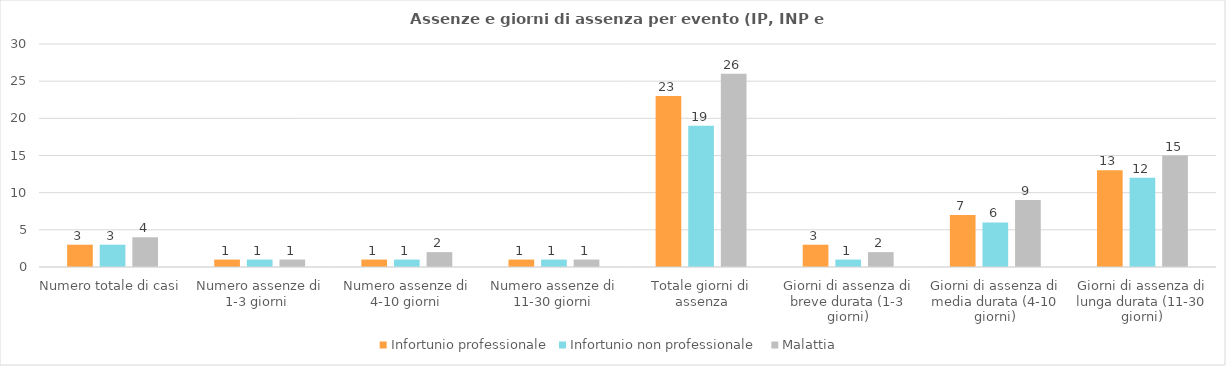
| Category | Infortunio professionale | Infortunio non professionale  | Malattia  |
|---|---|---|---|
| Numero totale di casi | 3 | 3 | 4 |
| Numero assenze di 1-3 giorni  | 1 | 1 | 1 |
| Numero assenze di 4-10 giorni | 1 | 1 | 2 |
| Numero assenze di 11-30 giorni | 1 | 1 | 1 |
| Totale giorni di assenza | 23 | 19 | 26 |
| Giorni di assenza di breve durata (1-3 giorni) | 3 | 1 | 2 |
| Giorni di assenza di media durata (4-10 giorni) | 7 | 6 | 9 |
| Giorni di assenza di lunga durata (11-30 giorni) | 13 | 12 | 15 |